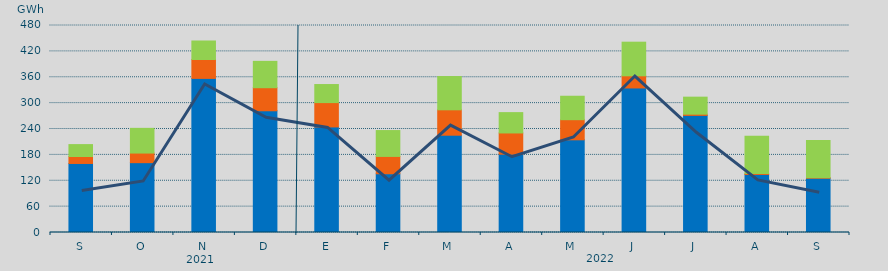
| Category | Asignación SEPE | Asignación Francia | Asignación Portugal |
|---|---|---|---|
| S | 160066 | 16160 | 27614.8 |
| O | 161949.6 | 22251.7 | 57303 |
| N | 357339.7 | 43842.5 | 42886.3 |
| D | 282259.4 | 53460 | 61129.1 |
| E | 244787.3 | 56434 | 41874.5 |
| F | 136191.8 | 40226.7 | 59973 |
| M | 225622.7 | 58889.7 | 77145.2 |
| A | 181585.4 | 49218 | 47192.7 |
| M | 214905.3 | 46679.2 | 54371.7 |
| J | 335176.8 | 28179 | 77960.7 |
| J | 271567.05 | 2839.1 | 39441.4 |
| A | 134609.35 | 2385 | 86328.9 |
| S | 125828.7 | 1385 | 85885 |